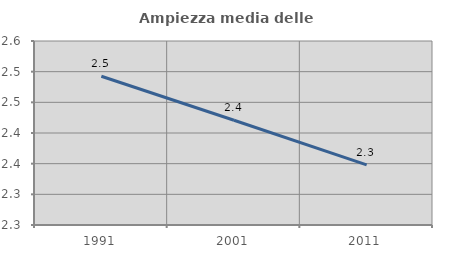
| Category | Ampiezza media delle famiglie |
|---|---|
| 1991.0 | 2.493 |
| 2001.0 | 2.421 |
| 2011.0 | 2.348 |